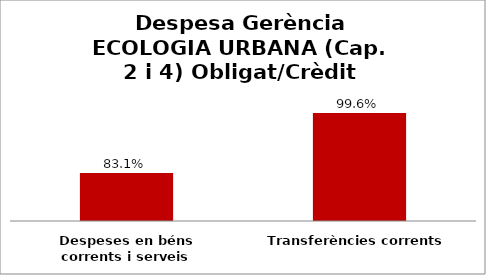
| Category | Series 0 |
|---|---|
| Despeses en béns corrents i serveis | 0.831 |
| Transferències corrents | 0.996 |